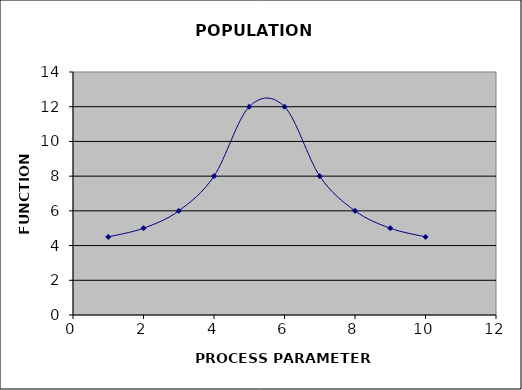
| Category | f(X) |
|---|---|
| 1.0 | 4.5 |
| 2.0 | 5 |
| 3.0 | 6 |
| 4.0 | 8 |
| 5.0 | 12 |
| 6.0 | 12 |
| 7.0 | 8 |
| 8.0 | 6 |
| 9.0 | 5 |
| 10.0 | 4.5 |